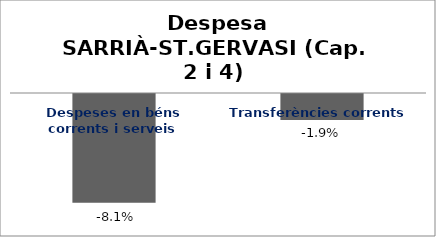
| Category | Series 0 |
|---|---|
| Despeses en béns corrents i serveis | -0.081 |
| Transferències corrents | -0.019 |